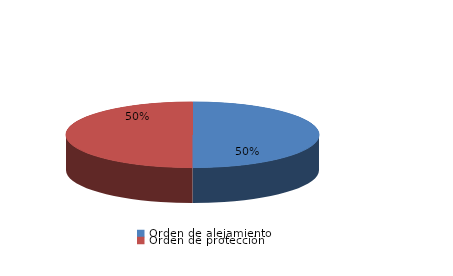
| Category | Series 0 |
|---|---|
| Orden de alejamiento | 18 |
| Orden de protección | 18 |